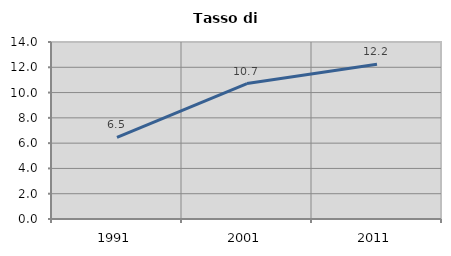
| Category | Tasso di disoccupazione   |
|---|---|
| 1991.0 | 6.452 |
| 2001.0 | 10.714 |
| 2011.0 | 12.245 |